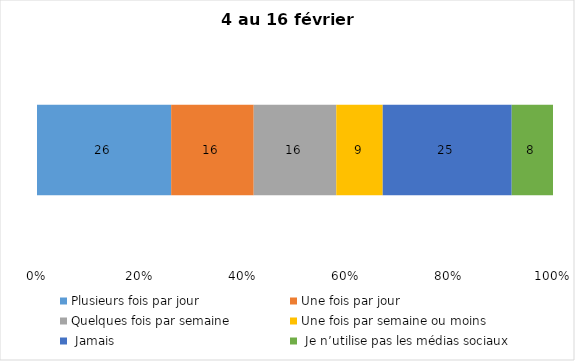
| Category | Plusieurs fois par jour | Une fois par jour | Quelques fois par semaine   | Une fois par semaine ou moins   |  Jamais   |  Je n’utilise pas les médias sociaux |
|---|---|---|---|---|---|---|
| 0 | 26 | 16 | 16 | 9 | 25 | 8 |